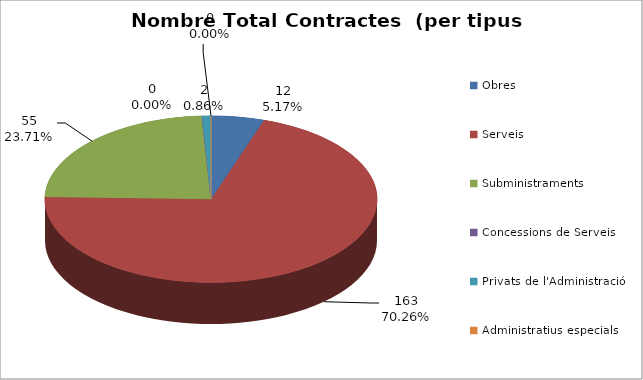
| Category | Nombre Total Contractes |
|---|---|
| Obres | 12 |
| Serveis | 163 |
| Subministraments | 55 |
| Concessions de Serveis | 0 |
| Privats de l'Administració | 2 |
| Administratius especials | 0 |